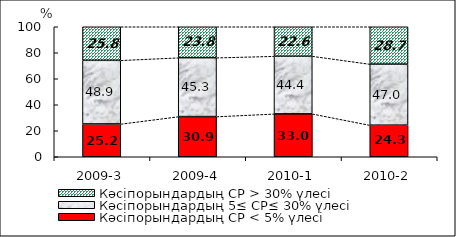
| Category | Кәсіпорындардың СР < 5% үлесі | Кәсіпорындардың 5≤ СР≤ 30% үлесі | Кәсіпорындардың СР > 30% үлесі |
|---|---|---|---|
| 2009-3 | 25.241 | 48.948 | 25.811 |
| 2009-4 | 30.913 | 45.291 | 23.796 |
| 2010-1 | 33.005 | 44.359 | 22.636 |
| 2010-2 | 24.3 | 46.981 | 28.719 |